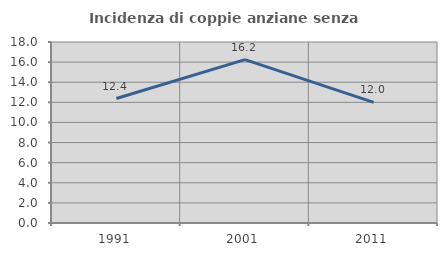
| Category | Incidenza di coppie anziane senza figli  |
|---|---|
| 1991.0 | 12.376 |
| 2001.0 | 16.246 |
| 2011.0 | 11.988 |